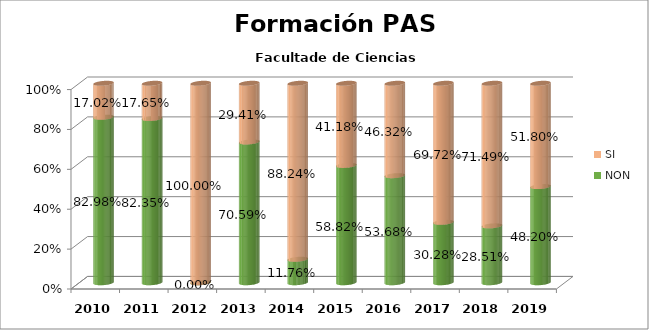
| Category | NON | SI |
|---|---|---|
| 2010.0 | 0.83 | 0.17 |
| 2011.0 | 0.824 | 0.176 |
| 2012.0 | 0 | 1 |
| 2013.0 | 0.706 | 0.294 |
| 2014.0 | 0.118 | 0.882 |
| 2015.0 | 0.588 | 0.412 |
| 2016.0 | 0.537 | 0.463 |
| 2017.0 | 0.303 | 0.697 |
| 2018.0 | 0.285 | 0.715 |
| 2019.0 | 0.482 | 0.518 |